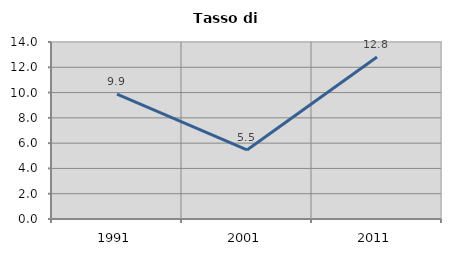
| Category | Tasso di disoccupazione   |
|---|---|
| 1991.0 | 9.886 |
| 2001.0 | 5.462 |
| 2011.0 | 12.812 |